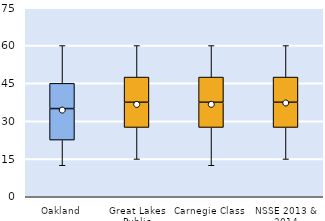
| Category | 25th | 50th | 75th |
|---|---|---|---|
| Oakland | 22.5 | 12.5 | 10 |
| Great Lakes Public | 27.5 | 10 | 10 |
| Carnegie Class | 27.5 | 10 | 10 |
| NSSE 2013 & 2014 | 27.5 | 10 | 10 |